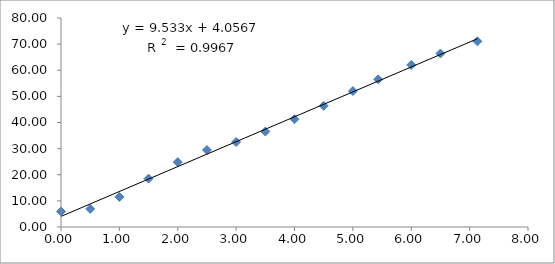
| Category | Series 0 |
|---|---|
| 0.0 | 5.94 |
| 0.5 | 6.93 |
| 1.0 | 11.51 |
| 1.5 | 18.53 |
| 2.0 | 24.84 |
| 2.5 | 29.47 |
| 3.0 | 32.54 |
| 3.5 | 36.53 |
| 4.0 | 41.27 |
| 4.5 | 46.38 |
| 5.0 | 52.03 |
| 5.433333333333334 | 56.51 |
| 6.0 | 62.01 |
| 6.5 | 66.41 |
| 7.133333333333334 | 71.07 |